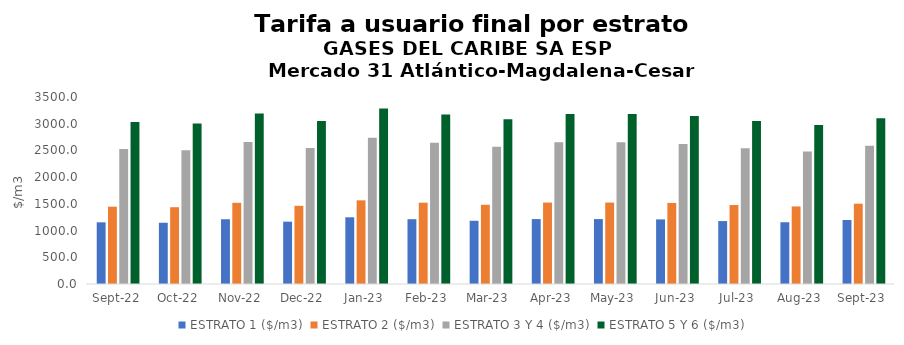
| Category | ESTRATO 1 ($/m3) | ESTRATO 2 ($/m3) | ESTRATO 3 Y 4 ($/m3) | ESTRATO 5 Y 6 ($/m3) |
|---|---|---|---|---|
| 2022-09-01 | 1154.32 | 1447.01 | 2525.28 | 3030.336 |
| 2022-10-01 | 1146.18 | 1437.12 | 2503.54 | 3004.248 |
| 2022-11-01 | 1212.06 | 1519.44 | 2658.31 | 3189.972 |
| 2022-12-01 | 1166.58 | 1463.43 | 2544.24 | 3053.088 |
| 2023-01-01 | 1248.7 | 1565.89 | 2736.03 | 3283.236 |
| 2023-02-01 | 1212.89 | 1521.57 | 2641.83 | 3170.196 |
| 2023-03-01 | 1183.19 | 1482.78 | 2568.94 | 3082.728 |
| 2023-04-01 | 1215.25 | 1524.46 | 2651.33 | 3181.596 |
| 2023-05-01 | 1215.25 | 1524.46 | 2651.33 | 3181.596 |
| 2023-06-01 | 1209.41 | 1517.12 | 2619.03 | 3142.836 |
| 2023-07-01 | 1178 | 1477.97 | 2542.18 | 3050.616 |
| 2023-08-01 | 1155.93 | 1451.92 | 2479.28 | 2975.136 |
| 2023-09-01 | 1198 | 1503.27 | 2586.8 | 3104.16 |